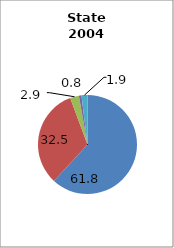
| Category | Arkansas |
|---|---|
| White | 61.844 |
| Black | 32.483 |
| Hispanic | 2.881 |
| Two or More Races | 0.846 |
| All Other1 | 1.946 |